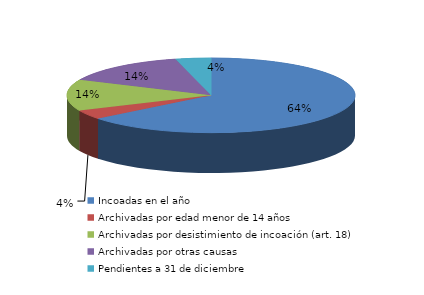
| Category | Series 0 |
|---|---|
| Incoadas en el año | 976 |
| Archivadas por edad menor de 14 años | 60 |
| Archivadas por desistimiento de incoación (art. 18) | 205 |
| Archivadas por otras causas | 216 |
| Pendientes a 31 de diciembre | 60 |